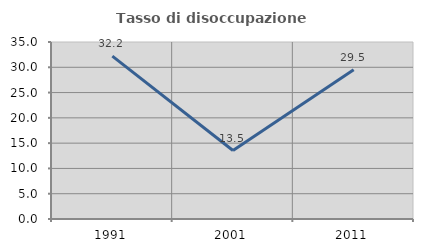
| Category | Tasso di disoccupazione giovanile  |
|---|---|
| 1991.0 | 32.215 |
| 2001.0 | 13.542 |
| 2011.0 | 29.508 |